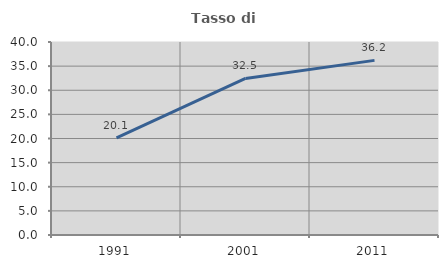
| Category | Tasso di occupazione   |
|---|---|
| 1991.0 | 20.118 |
| 2001.0 | 32.452 |
| 2011.0 | 36.191 |